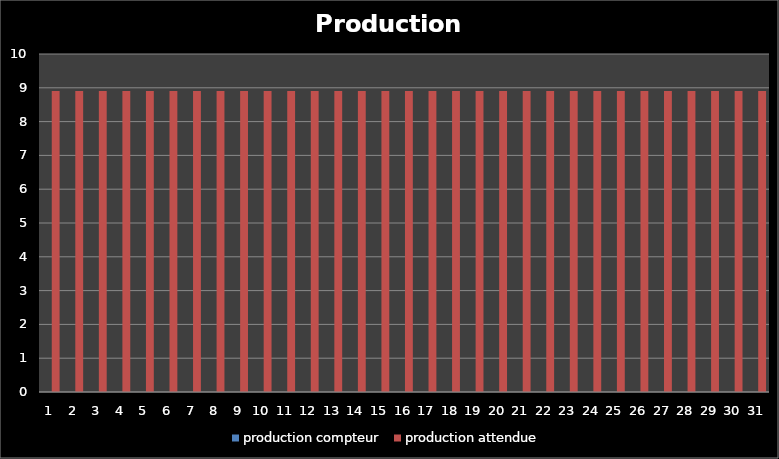
| Category | production compteur | production attendue |
|---|---|---|
| 1.0 | 0 | 8.903 |
| 2.0 | 0 | 8.903 |
| 3.0 | 0 | 8.903 |
| 4.0 | 0 | 8.903 |
| 5.0 | 0 | 8.903 |
| 6.0 | 0 | 8.903 |
| 7.0 | 0 | 8.903 |
| 8.0 | 0 | 8.903 |
| 9.0 | 0 | 8.903 |
| 10.0 | 0 | 8.903 |
| 11.0 | 0 | 8.903 |
| 12.0 | 0 | 8.903 |
| 13.0 | 0 | 8.903 |
| 14.0 | 0 | 8.903 |
| 15.0 | 0 | 8.903 |
| 16.0 | 0 | 8.903 |
| 17.0 | 0 | 8.903 |
| 18.0 | 0 | 8.903 |
| 19.0 | 0 | 8.903 |
| 20.0 | 0 | 8.903 |
| 21.0 | 0 | 8.903 |
| 22.0 | 0 | 8.903 |
| 23.0 | 0 | 8.903 |
| 24.0 | 0 | 8.903 |
| 25.0 | 0 | 8.903 |
| 26.0 | 0 | 8.903 |
| 27.0 | 0 | 8.903 |
| 28.0 | 0 | 8.903 |
| 29.0 | 0 | 8.903 |
| 30.0 | 0 | 8.903 |
| 31.0 | 0 | 8.903 |